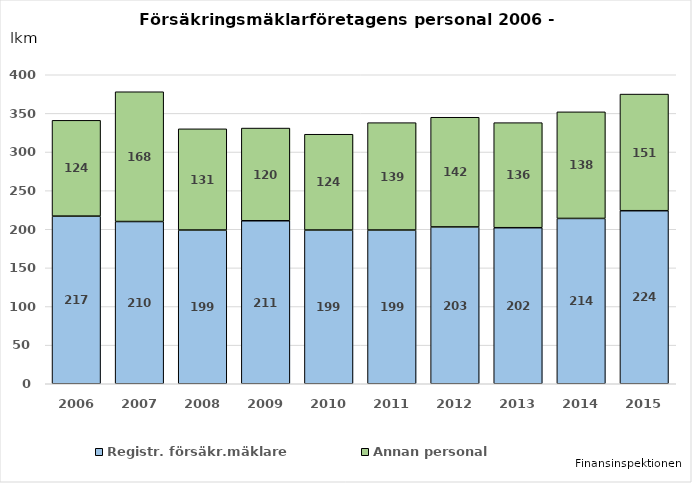
| Category | Registr. försäkr.mäklare | Annan personal |
|---|---|---|
| 2006.0 | 217 | 124 |
| 2007.0 | 210 | 168 |
| 2008.0 | 199 | 131 |
| 2009.0 | 211 | 120 |
| 2010.0 | 199 | 124 |
| 2011.0 | 199 | 139 |
| 2012.0 | 203 | 142 |
| 2013.0 | 202 | 136 |
| 2014.0 | 214 | 138 |
| 2015.0 | 224 | 151 |